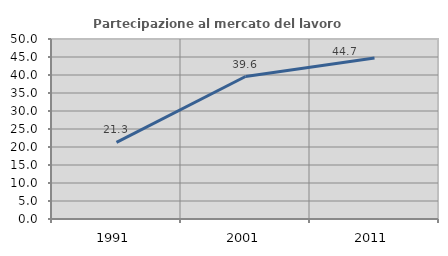
| Category | Partecipazione al mercato del lavoro  femminile |
|---|---|
| 1991.0 | 21.277 |
| 2001.0 | 39.583 |
| 2011.0 | 44.706 |